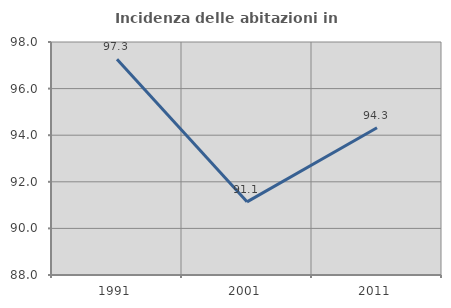
| Category | Incidenza delle abitazioni in proprietà  |
|---|---|
| 1991.0 | 97.26 |
| 2001.0 | 91.139 |
| 2011.0 | 94.318 |